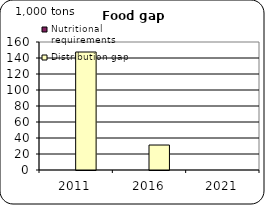
| Category | Nutritional requirements | Distribution gap |
|---|---|---|
| 2011.0 | 0 | 147.486 |
| 2016.0 | 0 | 31.226 |
| 2021.0 | 0 | 0 |